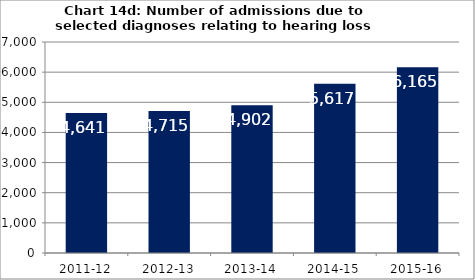
| Category | Chart 14d: Number of admissions due to selected diagnoses relating to hearing loss |
|---|---|
| 2011-12 | 4641 |
| 2012-13 | 4715 |
| 2013-14 | 4902 |
| 2014-15 | 5617 |
| 2015-16 | 6165 |